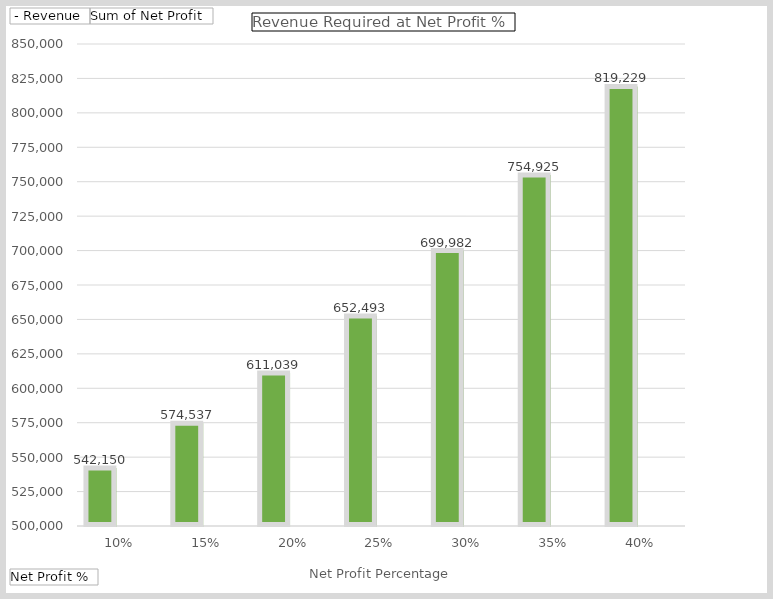
| Category |  - Revenue | Sum of Net Profit |
|---|---|---|
| 10% | 542150.466 | 54215.047 |
| 15% | 574536.994 | 86180.549 |
| 20% | 611038.709 | 122207.742 |
| 25% | 652493.166 | 163123.292 |
| 30% | 699981.752 | 209994.526 |
| 35% | 754925.375 | 264223.881 |
| 40% | 819229.069 | 327691.628 |